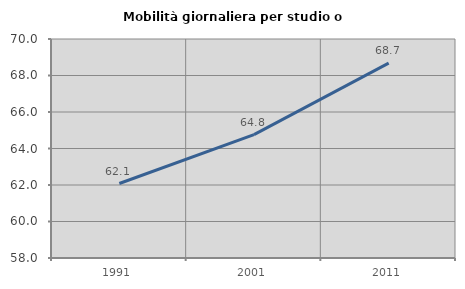
| Category | Mobilità giornaliera per studio o lavoro |
|---|---|
| 1991.0 | 62.082 |
| 2001.0 | 64.764 |
| 2011.0 | 68.676 |